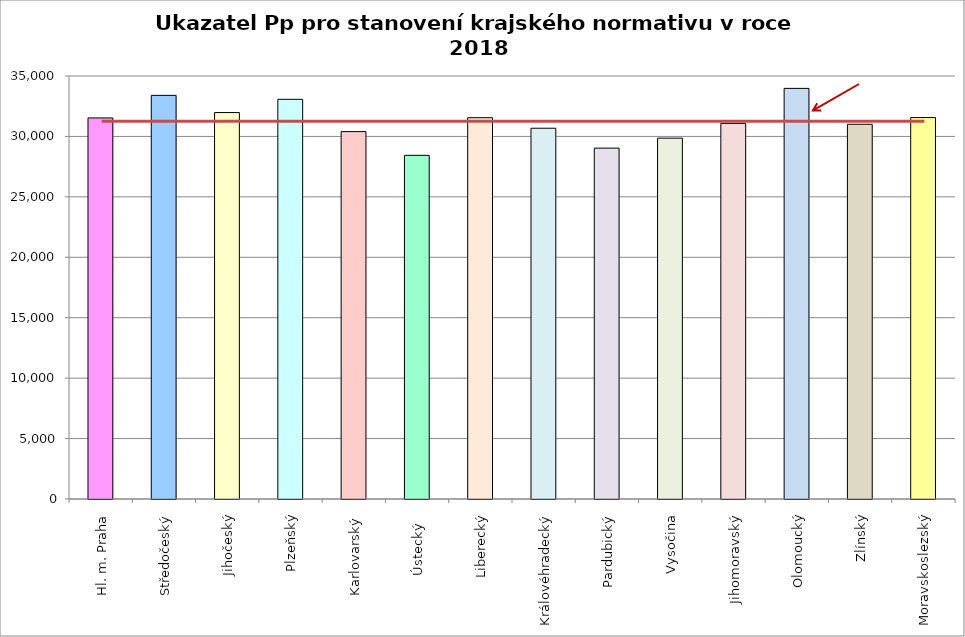
| Category | Series 0 |
|---|---|
| Hl. m. Praha | 31530 |
| Středočeský | 33398 |
| Jihočeský | 31975 |
| Plzeňský | 33070 |
| Karlovarský  | 30400 |
| Ústecký   | 28435 |
| Liberecký | 31550 |
| Královéhradecký | 30679 |
| Pardubický | 29031 |
| Vysočina | 29858 |
| Jihomoravský | 31079 |
| Olomoucký | 33975 |
| Zlínský | 31007 |
| Moravskoslezský | 31560 |